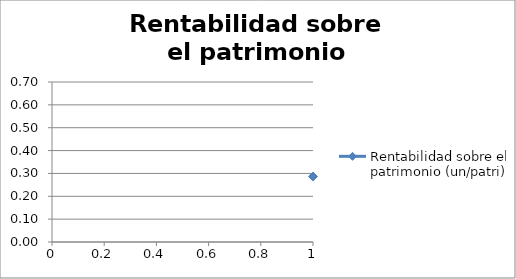
| Category | Rentabilidad sobre el patrimonio (un/patri) |
|---|---|
| 0 | 0.287 |
| 1 | 0.62 |
| 2 | 0.339 |
| 3 | 0.298 |
| 4 | 0.147 |
| 5 | 0.264 |
| 6 | 0.163 |
| 7 | 0.164 |